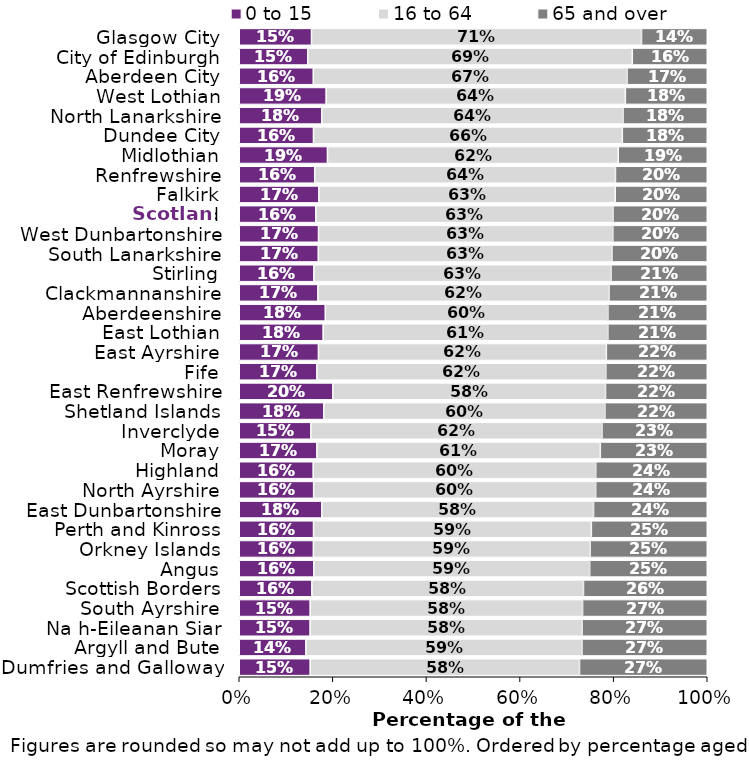
| Category | 0 to 15 | 16 to 64 | 65 and over |
|---|---|---|---|
| Dumfries and Galloway | 0.152 | 0.576 | 0.273 |
| Argyll and Bute | 0.142 | 0.59 | 0.268 |
| Na h-Eileanan Siar | 0.151 | 0.581 | 0.268 |
| South Ayrshire | 0.152 | 0.582 | 0.266 |
| Scottish Borders | 0.155 | 0.58 | 0.264 |
| Angus | 0.159 | 0.59 | 0.251 |
| Orkney Islands | 0.158 | 0.591 | 0.25 |
| Perth and Kinross | 0.159 | 0.594 | 0.248 |
| East Dunbartonshire | 0.176 | 0.581 | 0.243 |
| North Ayrshire | 0.159 | 0.603 | 0.238 |
| Highland | 0.158 | 0.604 | 0.238 |
| Moray | 0.166 | 0.606 | 0.228 |
| Inverclyde | 0.153 | 0.622 | 0.225 |
| Shetland Islands | 0.181 | 0.601 | 0.219 |
| East Renfrewshire | 0.2 | 0.583 | 0.217 |
| Fife | 0.166 | 0.617 | 0.217 |
| East Ayrshire | 0.169 | 0.615 | 0.216 |
| East Lothian | 0.179 | 0.608 | 0.212 |
| Aberdeenshire | 0.184 | 0.604 | 0.212 |
| Clackmannanshire | 0.168 | 0.622 | 0.21 |
| Stirling | 0.159 | 0.635 | 0.206 |
| South Lanarkshire | 0.169 | 0.628 | 0.204 |
| West Dunbartonshire | 0.169 | 0.629 | 0.202 |
| Scotland | 0.164 | 0.635 | 0.201 |
| Falkirk | 0.17 | 0.633 | 0.197 |
| Renfrewshire | 0.161 | 0.643 | 0.196 |
| Midlothian | 0.188 | 0.621 | 0.19 |
| Dundee City | 0.159 | 0.66 | 0.181 |
| North Lanarkshire | 0.176 | 0.644 | 0.18 |
| West Lothian | 0.186 | 0.639 | 0.175 |
| Aberdeen City | 0.158 | 0.67 | 0.171 |
| City of Edinburgh | 0.146 | 0.693 | 0.16 |
| Glasgow City | 0.154 | 0.705 | 0.14 |